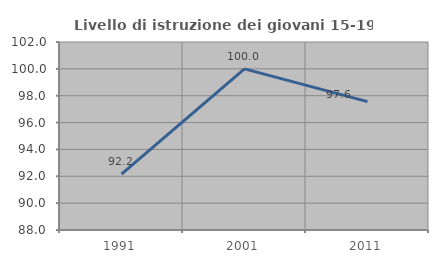
| Category | Livello di istruzione dei giovani 15-19 anni |
|---|---|
| 1991.0 | 92.157 |
| 2001.0 | 100 |
| 2011.0 | 97.561 |